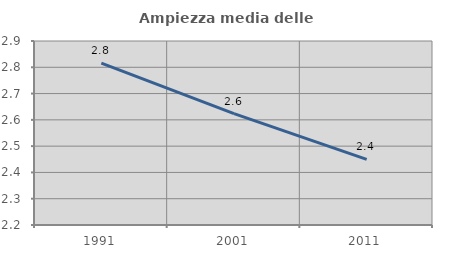
| Category | Ampiezza media delle famiglie |
|---|---|
| 1991.0 | 2.816 |
| 2001.0 | 2.624 |
| 2011.0 | 2.449 |